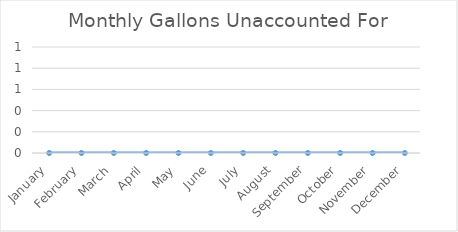
| Category | Monthly Gallons |
|---|---|
| January | 0 |
| February | 0 |
| March | 0 |
| April | 0 |
| May | 0 |
| June | 0 |
| July | 0 |
| August | 0 |
| September | 0 |
| October | 0 |
| November | 0 |
| December | 0 |